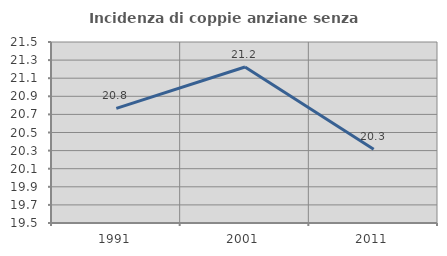
| Category | Incidenza di coppie anziane senza figli  |
|---|---|
| 1991.0 | 20.766 |
| 2001.0 | 21.224 |
| 2011.0 | 20.316 |